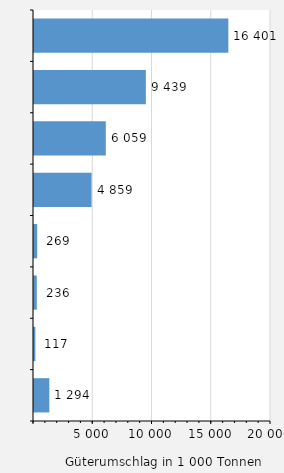
| Category | Güterumschlag |
|---|---|
| Lübeck | 16401 |
| Brunsbüttel | 9439 |
| Puttgarden / Fehmarn | 6059 |
| Kiel | 4859 |
| Dagebüll | 269 |
| Föhr | 236 |
| List / Sylt | 117 |
| Sonstige Häfen | 1294 |